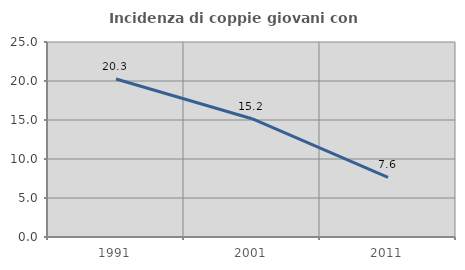
| Category | Incidenza di coppie giovani con figli |
|---|---|
| 1991.0 | 20.264 |
| 2001.0 | 15.166 |
| 2011.0 | 7.635 |